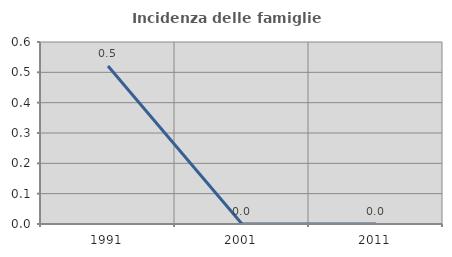
| Category | Incidenza delle famiglie numerose |
|---|---|
| 1991.0 | 0.521 |
| 2001.0 | 0 |
| 2011.0 | 0 |